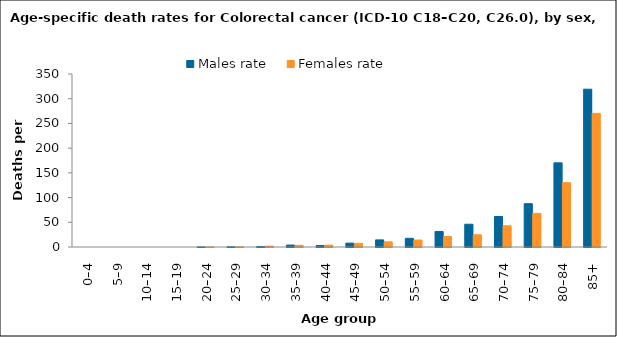
| Category | Males rate | Females rate |
|---|---|---|
| 0–4 | 0 | 0 |
| 5–9 | 0 | 0 |
| 10–14 | 0 | 0 |
| 15–19 | 0 | 0 |
| 20–24 | 0.118 | 0.126 |
| 25–29 | 0.433 | 0.332 |
| 30–34 | 1.055 | 1.756 |
| 35–39 | 3.935 | 3.354 |
| 40–44 | 3.089 | 3.824 |
| 45–49 | 7.845 | 7.444 |
| 50–54 | 14.375 | 10.479 |
| 55–59 | 17.494 | 14.097 |
| 60–64 | 31.425 | 20.994 |
| 65–69 | 46.069 | 24.718 |
| 70–74 | 61.688 | 42.948 |
| 75–79 | 87.658 | 68.036 |
| 80–84 | 170.197 | 130.084 |
| 85+ | 319.249 | 270.402 |